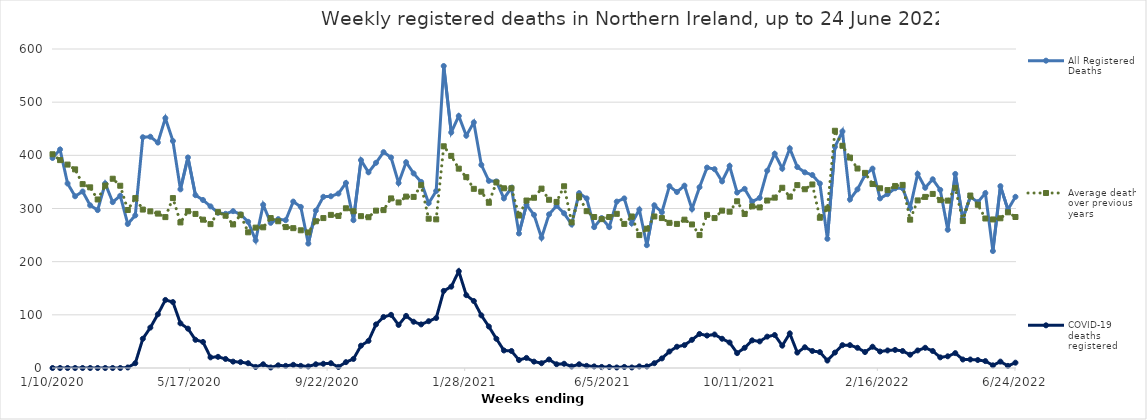
| Category | All Registered Deaths | Average deaths over previous 5 years | COVID-19 deaths registered |
|---|---|---|---|
| 1/10/20 | 395 | 402 | 0 |
| 1/17/20 | 411 | 391 | 0 |
| 1/24/20 | 347 | 382.6 | 0 |
| 1/31/20 | 323 | 373.6 | 0 |
| 2/7/20 | 332 | 345.8 | 0 |
| 2/14/20 | 306 | 339.8 | 0 |
| 2/21/20 | 297 | 317 | 0 |
| 2/28/20 | 347 | 343 | 0 |
| 3/6/20 | 312 | 356 | 0 |
| 3/13/20 | 324 | 342.8 | 0 |
| 3/20/20 | 271 | 297.2 | 1 |
| 3/27/20 | 287 | 319.6 | 9 |
| 4/3/20 | 434 | 298 | 55 |
| 4/10/20 | 435 | 294.6 | 76 |
| 4/17/20 | 424 | 290.4 | 101 |
| 4/24/20 | 470 | 283.8 | 128 |
| 5/1/20 | 427 | 319.6 | 124 |
| 5/8/20 | 336 | 273.8 | 84 |
| 5/15/20 | 396 | 294.8 | 74 |
| 5/22/20 | 325 | 289.8 | 53 |
| 5/29/20 | 316 | 279 | 49 |
| 6/5/20 | 304 | 270.6 | 20 |
| 6/12/20 | 292 | 293.2 | 21 |
| 6/19/20 | 290 | 286.4 | 17 |
| 6/26/20 | 295 | 270 | 12 |
| 7/3/20 | 289 | 288.2 | 11 |
| 7/10/20 | 275 | 255.2 | 9 |
| 7/17/20 | 240 | 264 | 2 |
| 7/24/20 | 307 | 264.6 | 7 |
| 7/31/20 | 273 | 282 | 1 |
| 8/7/20 | 280 | 276 | 5 |
| 8/14/20 | 278 | 265 | 4 |
| 8/21/20 | 313 | 263 | 6 |
| 8/28/20 | 303 | 259 | 4 |
| 9/4/20 | 234 | 255 | 3 |
| 9/11/20 | 296 | 276 | 7 |
| 9/18/20 | 322 | 282 | 8 |
| 9/25/20 | 323 | 288 | 9 |
| 10/2/20 | 328 | 286 | 2 |
| 10/9/20 | 348 | 300.4 | 11 |
| 10/16/20 | 278 | 294.8 | 17 |
| 10/23/20 | 391 | 285.6 | 42 |
| 10/30/20 | 368 | 283.6 | 51 |
| 11/6/20 | 386 | 296 | 82 |
| 11/13/20 | 406 | 297 | 96 |
| 11/20/20 | 396 | 319 | 100 |
| 11/27/20 | 348 | 311.4 | 81 |
| 12/4/20 | 387 | 322.4 | 98 |
| 12/11/20 | 366 | 321.8 | 87 |
| 12/18/20 | 350 | 343.8 | 82 |
| 12/25/20 | 310 | 280.8 | 88 |
| 1/1/21 | 333 | 279.6 | 94 |
| 1/8/21 | 568 | 417 | 145 |
| 1/15/21 | 443 | 399 | 153 |
| 1/22/21 | 474 | 375 | 182 |
| 1/29/21 | 437 | 359 | 137 |
| 2/5/21 | 462 | 337 | 126 |
| 2/12/21 | 382 | 331.6 | 99 |
| 2/19/21 | 352 | 310.8 | 78 |
| 2/26/21 | 351 | 349 | 55 |
| 3/5/21 | 319 | 338 | 33 |
| 3/12/21 | 339 | 338 | 32 |
| 3/19/21 | 253 | 286.8 | 15 |
| 3/26/21 | 307 | 315 | 19 |
| 4/2/21 | 288 | 320.2 | 12 |
| 4/9/21 | 245 | 337.4 | 9 |
| 4/16/21 | 289 | 316.4 | 16 |
| 4/23/21 | 305 | 312.4 | 7 |
| 4/30/21 | 291 | 341.8 | 8 |
| 5/7/21 | 270 | 274 | 3 |
| 5/14/21 | 329 | 323 | 7 |
| 5/21/21 | 319 | 295 | 4 |
| 5/28/21 | 265 | 284 | 3 |
| 6/4/21 | 282 | 280 | 2 |
| 6/11/21 | 265 | 284 | 2 |
| 6/18/21 | 313 | 290 | 1 |
| 6/25/21 | 319 | 271 | 2 |
| 7/2/21 | 272 | 285 | 1 |
| 7/9/21 | 298 | 250 | 3 |
| 7/16/21 | 231 | 262 | 3 |
| 7/23/21 | 306 | 285 | 9 |
| 7/30/21 | 293 | 282 | 18 |
| 8/6/21 | 342 | 273 | 31 |
| 8/13/21 | 331 | 271 | 40 |
| 8/20/21 | 343 | 279 | 43 |
| 8/27/21 | 299 | 270 | 53 |
| 9/3/21 | 340 | 250 | 64 |
| 9/10/21 | 377 | 288 | 61 |
| 9/17/21 | 374 | 282 | 63 |
| 9/24/21 | 351 | 296 | 55 |
| 10/1/21 | 380 | 294 | 48 |
| 10/8/21 | 330 | 313.6 | 28 |
| 10/15/21 | 337 | 289.6 | 38 |
| 10/22/21 | 313 | 304 | 52 |
| 10/29/21 | 320 | 302 | 50 |
| 11/5/21 | 371 | 315 | 59 |
| 11/12/21 | 403 | 320.4 | 62 |
| 11/19/21 | 375 | 339 | 42 |
| 11/26/21 | 413 | 322.2 | 65 |
| 12/3/21 | 378 | 344 | 29 |
| 12/10/21 | 368 | 336.2 | 39 |
| 12/17/21 | 363 | 345.2 | 32 |
| 12/24/21 | 347 | 282.6 | 30 |
| 12/31/21 | 243 | 299.8 | 14 |
| 1/7/22 | 416 | 446.2 | 29 |
| 1/14/22 | 445 | 418 | 43 |
| 1/21/22 | 317 | 395.8 | 43 |
| 1/28/22 | 336 | 375.2 | 38 |
| 2/4/22 | 363 | 367 | 30 |
| 2/11/22 | 375 | 346 | 40 |
| 2/18/22 | 319 | 338 | 31 |
| 2/25/22 | 327 | 334.6 | 33 |
| 3/4/22 | 338 | 342.4 | 34 |
| 3/11/22 | 338 | 344.4 | 32 |
| 3/18/22 | 301 | 279 | 25 |
| 3/25/22 | 365 | 315.2 | 33 |
| 4/1/22 | 339 | 321.8 | 38 |
| 4/8/22 | 355 | 327.4 | 32 |
| 4/15/22 | 335 | 315.8 | 20 |
| 4/22/22 | 260 | 314.8 | 22 |
| 4/29/22 | 365 | 338.8 | 28 |
| 5/6/22 | 281 | 276.4 | 16 |
| 5/13/22 | 322 | 324.4 | 16 |
| 5/20/22 | 312 | 307 | 15 |
| 5/27/22 | 329 | 281.2 | 13 |
| 6/3/22 | 220 | 279.4 | 5 |
| 6/10/22 | 342 | 281.6 | 12 |
| 6/17/22 | 298 | 292.8 | 4 |
| 6/24/22 | 322 | 284 | 10 |